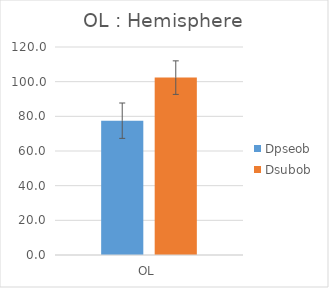
| Category | Dpseob | Dsubob |
|---|---|---|
| OL | 77.489 | 102.333 |